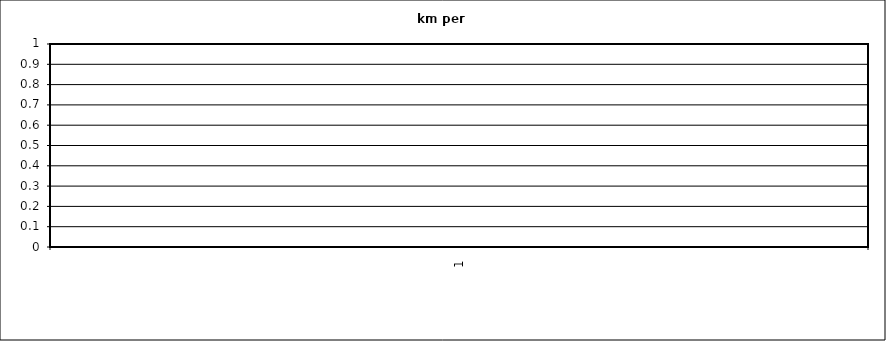
| Category | Series 0 | Series 1 | Series 2 | Series 3 | Series 4 | Series 5 | Series 6 | Series 7 | Series 8 | Series 9 | Series 10 | Series 11 |
|---|---|---|---|---|---|---|---|---|---|---|---|---|
| 0 | 0 | 0 | 0 | 0 | 0 | 0 | 0 | 0 | 0 | 0 | 0 | 0 |